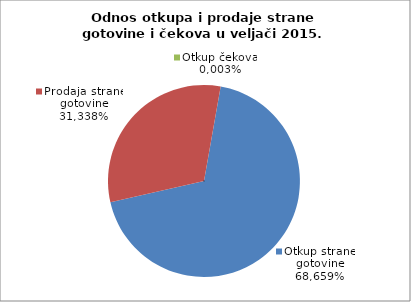
| Category | Otkup strane gotovine |
|---|---|
| 0 | 0.687 |
| 1 | 0.313 |
| 2 | 0 |